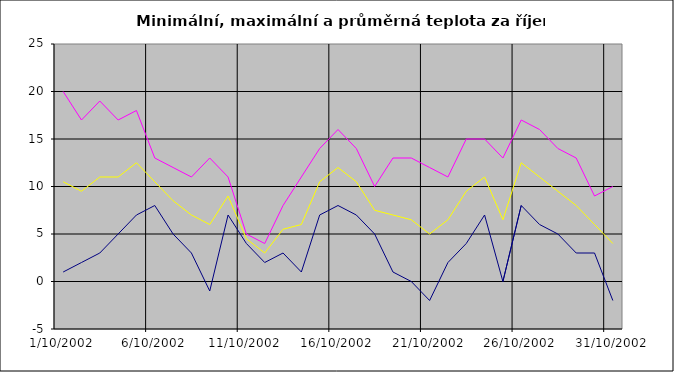
| Category | Series 0 | Series 1 | Series 2 |
|---|---|---|---|
| 2002-10-01 | 1 | 20 | 10.5 |
| 2002-10-02 | 2 | 17 | 9.5 |
| 2002-10-03 | 3 | 19 | 11 |
| 2002-10-04 | 5 | 17 | 11 |
| 2002-10-05 | 7 | 18 | 12.5 |
| 2002-10-06 | 8 | 13 | 10.5 |
| 2002-10-07 | 5 | 12 | 8.5 |
| 2002-10-08 | 3 | 11 | 7 |
| 2002-10-09 | -1 | 13 | 6 |
| 2002-10-10 | 7 | 11 | 9 |
| 2002-10-11 | 4 | 5 | 4.5 |
| 2002-10-12 | 2 | 4 | 3 |
| 2002-10-13 | 3 | 8 | 5.5 |
| 2002-10-14 | 1 | 11 | 6 |
| 2002-10-15 | 7 | 14 | 10.5 |
| 2002-10-16 | 8 | 16 | 12 |
| 2002-10-17 | 7 | 14 | 10.5 |
| 2002-10-18 | 5 | 10 | 7.5 |
| 2002-10-19 | 1 | 13 | 7 |
| 2002-10-20 | 0 | 13 | 6.5 |
| 2002-10-21 | -2 | 12 | 5 |
| 2002-10-22 | 2 | 11 | 6.5 |
| 2002-10-23 | 4 | 15 | 9.5 |
| 2002-10-24 | 7 | 15 | 11 |
| 2002-10-25 | 0 | 13 | 6.5 |
| 2002-10-26 | 8 | 17 | 12.5 |
| 2002-10-27 | 6 | 16 | 11 |
| 2002-10-28 | 5 | 14 | 9.5 |
| 2002-10-29 | 3 | 13 | 8 |
| 2002-10-30 | 3 | 9 | 6 |
| 2002-10-31 | -2 | 10 | 4 |